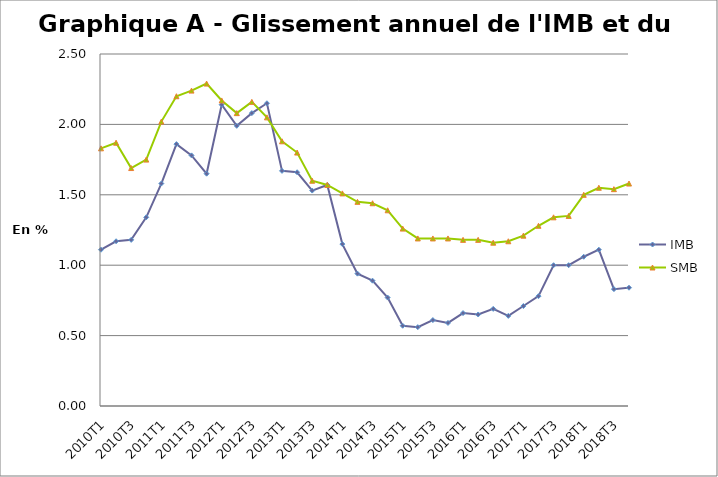
| Category | IMB | SMB |
|---|---|---|
| 2010T1 | 1.11 | 1.83 |
| 2010T2 | 1.17 | 1.87 |
| 2010T3 | 1.18 | 1.69 |
| 2010T4 | 1.34 | 1.75 |
| 2011T1 | 1.58 | 2.02 |
| 2011T2 | 1.86 | 2.2 |
| 2011T3 | 1.78 | 2.24 |
| 2011T4 | 1.65 | 2.29 |
| 2012T1 | 2.14 | 2.17 |
| 2012T2 | 1.99 | 2.08 |
| 2012T3 | 2.08 | 2.16 |
| 2012T4 | 2.15 | 2.05 |
| 2013T1 | 1.67 | 1.88 |
| 2013T2 | 1.66 | 1.8 |
| 2013T3 | 1.53 | 1.6 |
| 2013T4 | 1.57 | 1.57 |
| 2014T1 | 1.15 | 1.51 |
| 2014T2 | 0.94 | 1.45 |
| 2014T3 | 0.89 | 1.44 |
| 2014T4 | 0.77 | 1.39 |
| 2015T1 | 0.57 | 1.26 |
| 2015T2 | 0.56 | 1.19 |
| 2015T3 | 0.61 | 1.19 |
| 2015T4 | 0.59 | 1.19 |
| 2016T1 | 0.66 | 1.18 |
| 2016T2 | 0.65 | 1.18 |
| 2016T3 | 0.69 | 1.16 |
| 2016T4 | 0.64 | 1.17 |
| 2017T1 | 0.71 | 1.21 |
| 2017T2 | 0.78 | 1.28 |
| 2017T3 | 1 | 1.34 |
| 2017T4 | 1 | 1.35 |
| 2018T1 | 1.06 | 1.5 |
| 2018T2 | 1.11 | 1.55 |
| 2018T3 | 0.83 | 1.54 |
| 2018T4 | 0.84 | 1.58 |